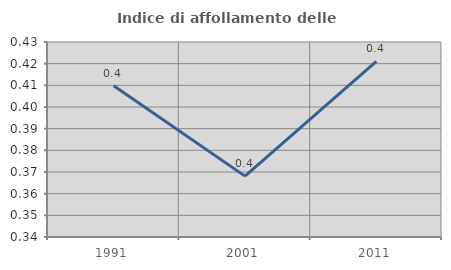
| Category | Indice di affollamento delle abitazioni  |
|---|---|
| 1991.0 | 0.41 |
| 2001.0 | 0.368 |
| 2011.0 | 0.421 |